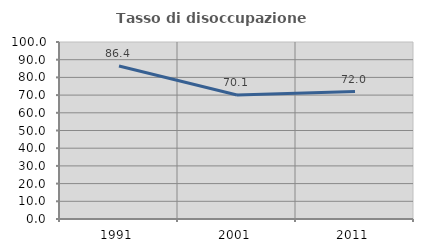
| Category | Tasso di disoccupazione giovanile  |
|---|---|
| 1991.0 | 86.425 |
| 2001.0 | 70.093 |
| 2011.0 | 72 |